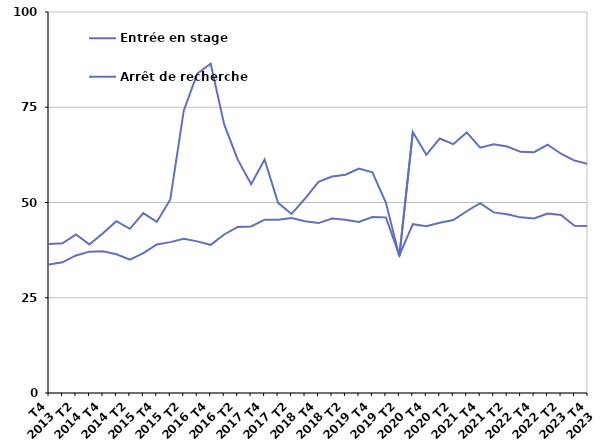
| Category | Entrée en stage | Arrêt de recherche |
|---|---|---|
| T4
2013 | 39.1 | 33.7 |
| T1
2014 | 39.3 | 34.3 |
| T2
2014 | 41.6 | 36.1 |
| T3
2014 | 39 | 37.1 |
| T4
2014 | 41.9 | 37.2 |
| T1
2015 | 45.1 | 36.4 |
| T2
2015 | 43.1 | 35 |
| T3
2015 | 47.2 | 36.7 |
| T4
2015 | 44.9 | 39 |
| T1
2016 | 50.8 | 39.6 |
| T2
2016 | 74.1 | 40.5 |
| T3
2016 | 83.8 | 39.8 |
| T4
2016 | 86.4 | 38.9 |
| T1
2017 | 70.5 | 41.6 |
| T2
2017 | 61.3 | 43.6 |
| T3
2017 | 54.8 | 43.7 |
| T4
2017 | 61.3 | 45.5 |
| T1
2018 | 49.9 | 45.5 |
| T2
2018 | 47 | 45.9 |
| T3
2018 | 51 | 45.1 |
| T4
2018 | 55.4 | 44.6 |
| T1
2019 | 56.8 | 45.8 |
| T2
2019 | 57.3 | 45.5 |
| T3
2019 | 58.9 | 44.9 |
| T4
2019 | 57.9 | 46.2 |
| T1
2020 | 50 | 46.1 |
| T2
2020 | 35.9 | 36.1 |
| T3
2020 | 68.5 | 44.3 |
| T4
2020 | 62.5 | 43.8 |
| T1
2021 | 66.8 | 44.7 |
| T2
2021 | 65.3 | 45.4 |
| T3
2021 | 68.4 | 47.7 |
| T4
2021 | 64.4 | 49.8 |
| T1
2022 | 65.3 | 47.4 |
| T2
2022 | 64.7 | 46.9 |
| T3
2022 | 63.3 | 46.1 |
| T4
2022 | 63.2 | 45.8 |
| T1
2023 | 65.2 | 47.1 |
| T2
2023 | 62.8 | 46.7 |
| T3
2023 | 61 | 43.9 |
| T4
2023 | 60.1 | 43.8 |